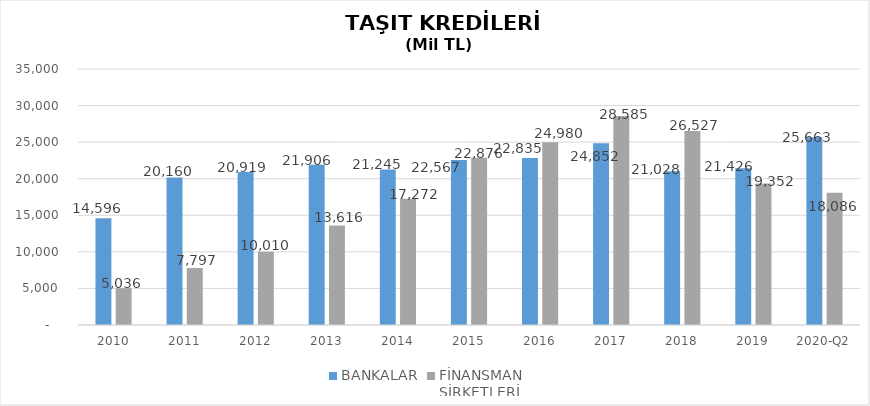
| Category | BANKALAR | FİNANSMAN 
ŞİRKETLERİ |
|---|---|---|
| 2010 | 14596 | 5035.89 |
| 2011 | 20160 | 7796.854 |
| 2012 | 20919 | 10009.755 |
| 2013 | 21906 | 13616.036 |
| 2014 | 21245 | 17271.844 |
| 2015 | 22567 | 22875.563 |
| 2016 | 22835 | 24980.231 |
| 2017 | 24852 | 28584.938 |
| 2018 | 21028 | 26527.133 |
| 2019 | 21426.2 | 19352.327 |
| 2020-Q2 | 25662.91 | 18086.409 |